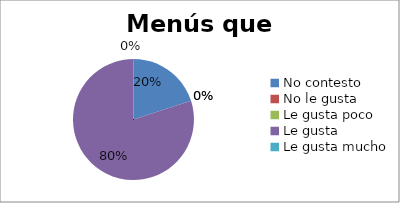
| Category | Series 0 |
|---|---|
| No contesto | 1 |
| No le gusta | 0 |
| Le gusta poco | 0 |
| Le gusta | 4 |
| Le gusta mucho | 0 |